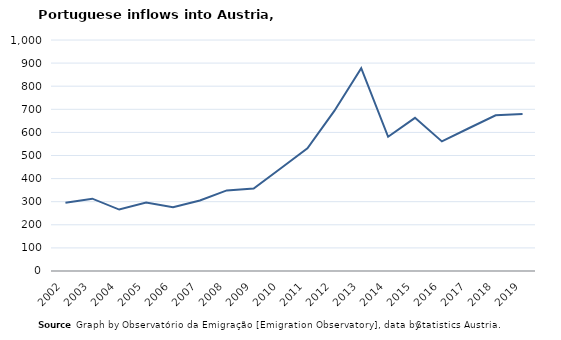
| Category | Entradas |
|---|---|
| 2002.0 | 295 |
| 2003.0 | 313 |
| 2004.0 | 266 |
| 2005.0 | 296 |
| 2006.0 | 276 |
| 2007.0 | 305 |
| 2008.0 | 349 |
| 2009.0 | 357 |
| 2010.0 | 444 |
| 2011.0 | 531 |
| 2012.0 | 693 |
| 2013.0 | 878 |
| 2014.0 | 581 |
| 2015.0 | 663 |
| 2016.0 | 561 |
| 2017.0 | 618 |
| 2018.0 | 674 |
| 2019.0 | 680 |